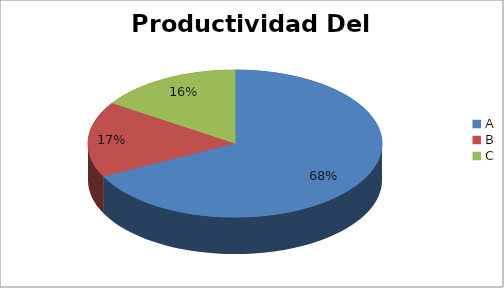
| Category | Series 0 |
|---|---|
| A | 67.593 |
| B | 16.667 |
| C | 15.741 |